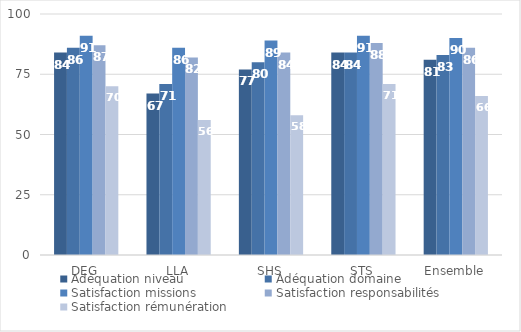
| Category | Adéquation niveau | Adéquation domaine | Satisfaction missions | Satisfaction responsabilités | Satisfaction rémunération |
|---|---|---|---|---|---|
| DEG | 84 | 86 | 91 | 87 | 70 |
| LLA | 67 | 71 | 86 | 82 | 56 |
| SHS | 77 | 80 | 89 | 84 | 58 |
| STS | 84 | 84 | 91 | 88 | 71 |
| Ensemble | 81 | 83 | 90 | 86 | 66 |